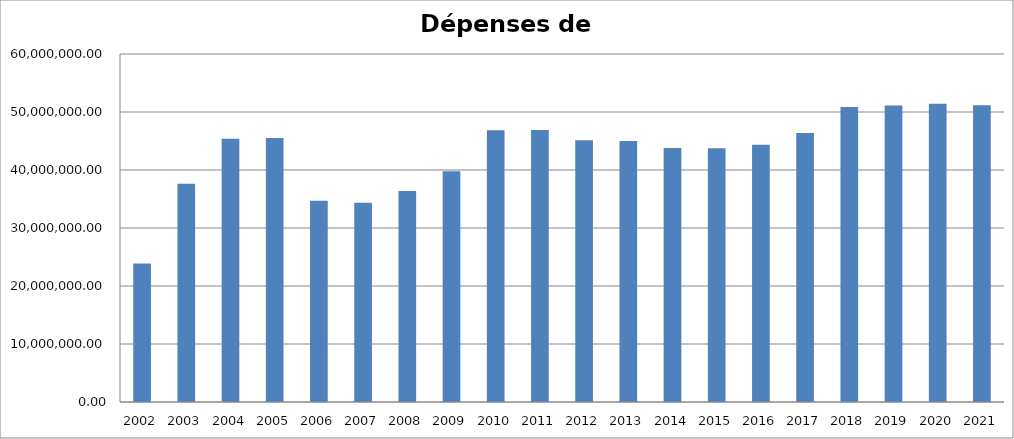
| Category | Series 0 |
|---|---|
| 2002.0 | 23879324.604 |
| 2003.0 | 37619621.3 |
| 2004.0 | 45368896.89 |
| 2005.0 | 45509683.82 |
| 2006.0 | 34682433.92 |
| 2007.0 | 34343535.85 |
| 2008.0 | 36398374.37 |
| 2009.0 | 39797768.77 |
| 2010.0 | 46871705.67 |
| 2011.0 | 46908123.24 |
| 2012.0 | 45136111.44 |
| 2013.0 | 45009456.29 |
| 2014.0 | 43804359.31 |
| 2015.0 | 43742159.61 |
| 2016.0 | 44349756.71 |
| 2017.0 | 46383287.47 |
| 2018.0 | 50867551.54 |
| 2019.0 | 51132868.69 |
| 2020.0 | 51409737.25 |
| 2021.0 | 51172306.75 |